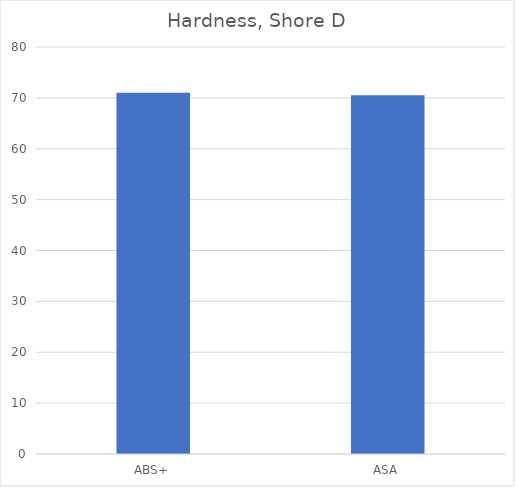
| Category | Shore D |
|---|---|
| ABS+ | 71 |
| ASA | 70.5 |